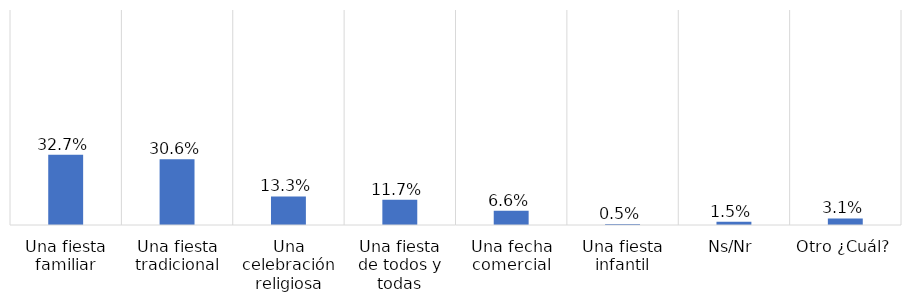
| Category | Series 0 |
|---|---|
| Una fiesta familiar | 0.327 |
| Una fiesta tradicional | 0.306 |
| Una celebración religiosa | 0.133 |
| Una fiesta de todos y todas | 0.117 |
| Una fecha comercial | 0.066 |
| Una fiesta infantil | 0.005 |
| Ns/Nr | 0.015 |
| Otro ¿Cuál? | 0.031 |